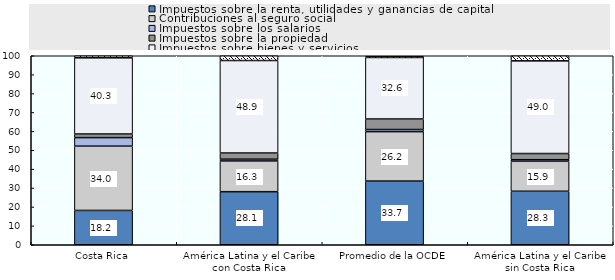
| Category | Impuestos sobre la renta, utilidades y ganancias de capital | Contribuciones al seguro social | Impuestos sobre los salarios | Impuestos sobre la propiedad | Impuestos sobre bienes y servicios | Otros impuestos |
|---|---|---|---|---|---|---|
| Costa Rica | 18.156 | 34.023 | 4.505 | 1.916 | 40.314 | 1.086 |
| América Latina y el Caribe con Costa Rica | 28.082 | 16.252 | 0.942 | 3.265 | 48.933 | 2.527 |
| Promedio de la OCDE | 33.693 | 26.151 | 1.123 | 5.569 | 32.554 | 0.665 |
| América Latina y el Caribe sin Costa Rica | 28.308 | 15.853 | 0.823 | 3.283 | 49.034 | 2.699 |